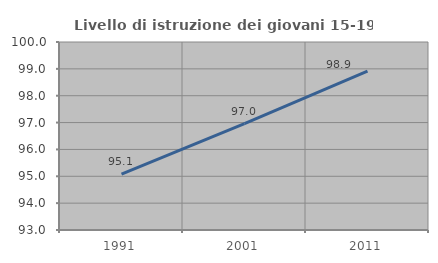
| Category | Livello di istruzione dei giovani 15-19 anni |
|---|---|
| 1991.0 | 95.082 |
| 2001.0 | 96.96 |
| 2011.0 | 98.913 |